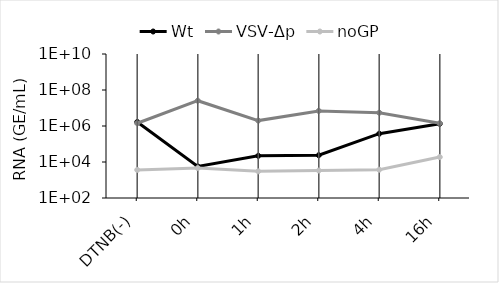
| Category | Wt | VSV-∆p | noGP |
|---|---|---|---|
| DTNB(-) | 1663285.824 | 1420979.529 | 3641.454 |
| 0h | 5672.634 | 25432851.819 | 4576.971 |
| 1h | 22102.087 | 1994319.6 | 3027.738 |
| 2h | 23747.02 | 6897996.399 | 3356.839 |
| 4h | 373059.536 | 5460090.301 | 3727.81 |
| 16h | 1333782.287 | 1426187.207 | 18788.278 |